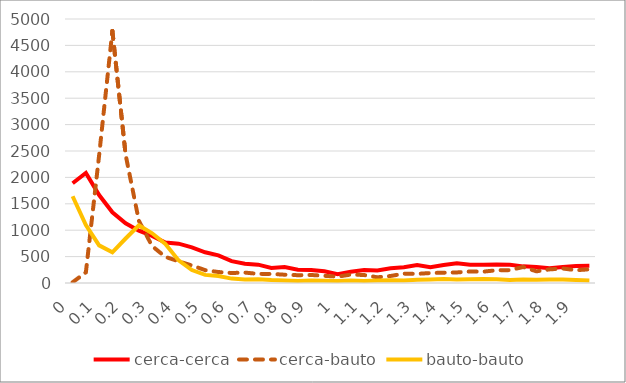
| Category | cerca-cerca | cerca-bauto | bauto-bauto |
|---|---|---|---|
| 0 | 1890 | 13 | 1643 |
| 1 | 2085 | 202 | 1099 |
| 2 | 1665 | 2420 | 713 |
| 3 | 1340 | 4774 | 582 |
| 4 | 1131 | 2429 | 843 |
| 5 | 990 | 1178 | 1094 |
| 6 | 891 | 699 | 941 |
| 7 | 765 | 495 | 739 |
| 8 | 745 | 411 | 428 |
| 9 | 674 | 332 | 245 |
| 10 | 581 | 244 | 154 |
| 11 | 524 | 208 | 134 |
| 12 | 414 | 189 | 83 |
| 13 | 364 | 197 | 66 |
| 14 | 347 | 173 | 72 |
| 15 | 283 | 172 | 57 |
| 16 | 302 | 157 | 49 |
| 17 | 253 | 148 | 38 |
| 18 | 248 | 152 | 45 |
| 19 | 223 | 136 | 41 |
| 20 | 165 | 120 | 40 |
| 21 | 214 | 160 | 45 |
| 22 | 248 | 151 | 40 |
| 23 | 236 | 108 | 48 |
| 24 | 278 | 133 | 51 |
| 25 | 299 | 177 | 46 |
| 26 | 339 | 173 | 60 |
| 27 | 297 | 189 | 67 |
| 28 | 339 | 195 | 76 |
| 29 | 375 | 200 | 66 |
| 30 | 346 | 219 | 72 |
| 31 | 344 | 215 | 75 |
| 32 | 349 | 242 | 71 |
| 33 | 347 | 244 | 55 |
| 34 | 315 | 303 | 64 |
| 35 | 305 | 221 | 62 |
| 36 | 279 | 258 | 65 |
| 37 | 305 | 274 | 68 |
| 38 | 324 | 242 | 58 |
| 39 | 325 | 259 | 48 |